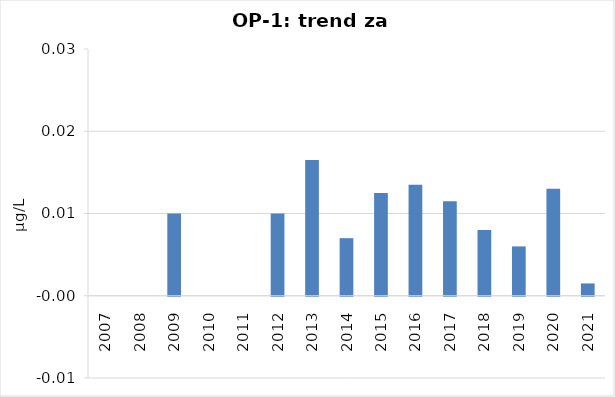
| Category | Vsota |
|---|---|
| 2007 | 0 |
| 2008 | 0 |
| 2009 | 0.01 |
| 2010 | 0 |
| 2011 | 0 |
| 2012 | 0.01 |
| 2013 | 0.016 |
| 2014 | 0.007 |
| 2015 | 0.012 |
| 2016 | 0.014 |
| 2017 | 0.012 |
| 2018 | 0.008 |
| 2019 | 0.006 |
| 2020 | 0.013 |
| 2021 | 0.002 |